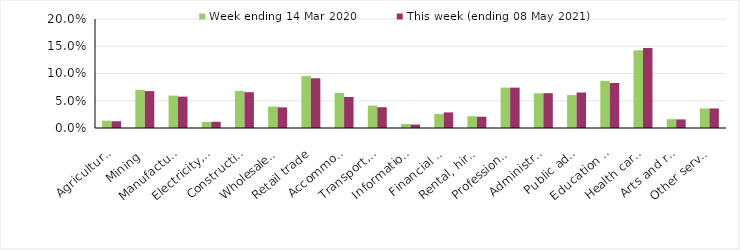
| Category | Week ending 14 Mar 2020 | This week (ending 08 May 2021) |
|---|---|---|
| Agriculture, forestry and fishing | 0.014 | 0.012 |
| Mining | 0.07 | 0.068 |
| Manufacturing | 0.059 | 0.058 |
| Electricity, gas, water and waste services | 0.011 | 0.011 |
| Construction | 0.068 | 0.066 |
| Wholesale trade | 0.039 | 0.038 |
| Retail trade | 0.095 | 0.091 |
| Accommodation and food services | 0.064 | 0.057 |
| Transport, postal and warehousing | 0.041 | 0.038 |
| Information media and telecommunications | 0.007 | 0.006 |
| Financial and insurance services | 0.026 | 0.029 |
| Rental, hiring and real estate services | 0.022 | 0.021 |
| Professional, scientific and technical services | 0.074 | 0.074 |
| Administrative and support services | 0.064 | 0.064 |
| Public administration and safety | 0.06 | 0.065 |
| Education and training | 0.086 | 0.083 |
| Health care and social assistance | 0.143 | 0.147 |
| Arts and recreation services | 0.016 | 0.016 |
| Other services | 0.036 | 0.036 |